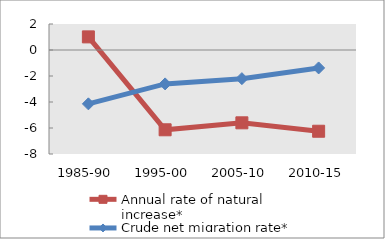
| Category | Annual rate of natural increase* | Crude net migration rate* |
|---|---|---|
| 1985-90 | 1.009 | -4.142 |
| 1995-00 | -6.138 | -2.607 |
| 2005-10 | -5.602 | -2.203 |
| 2010-15 | -6.249 | -1.379 |